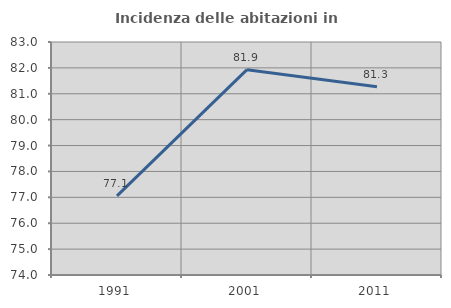
| Category | Incidenza delle abitazioni in proprietà  |
|---|---|
| 1991.0 | 77.058 |
| 2001.0 | 81.932 |
| 2011.0 | 81.275 |